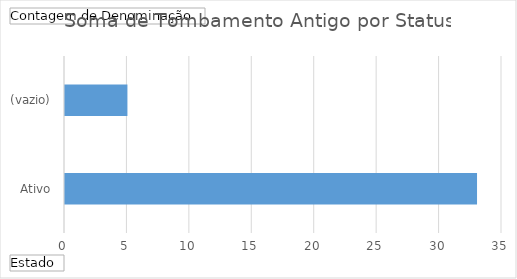
| Category | Total |
|---|---|
| Ativo | 33 |
| (vazio) | 5 |